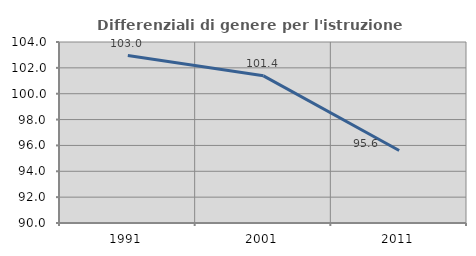
| Category | Differenziali di genere per l'istruzione superiore |
|---|---|
| 1991.0 | 102.952 |
| 2001.0 | 101.384 |
| 2011.0 | 95.609 |